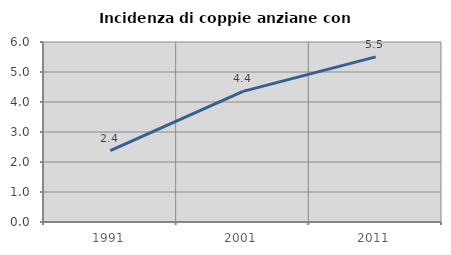
| Category | Incidenza di coppie anziane con figli |
|---|---|
| 1991.0 | 2.381 |
| 2001.0 | 4.355 |
| 2011.0 | 5.505 |